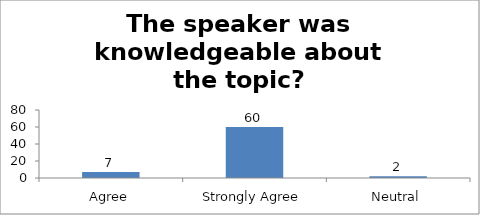
| Category | The speaker was knowledgeable about the topic? |
|---|---|
| Agree | 7 |
| Strongly Agree | 60 |
| Neutral | 2 |